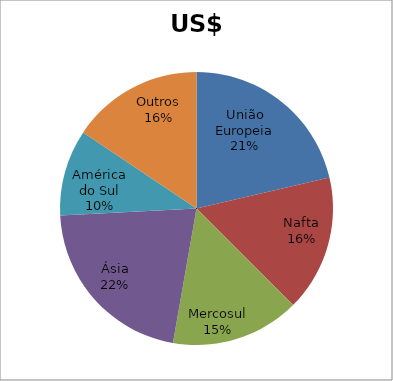
| Category | Series 0 |
|---|---|
| União Europeia | 0.214 |
| Nafta | 0.161 |
| Mercosul | 0.153 |
| Ásia | 0.214 |
| América do Sul | 0.102 |
| Outros | 0.156 |